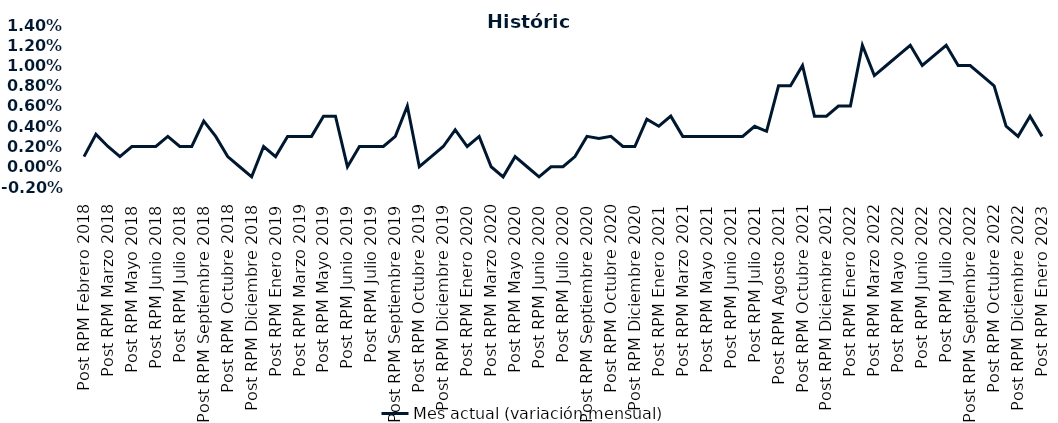
| Category | Mes actual (variación mensual)  |
|---|---|
| Post RPM Febrero 2018 | 0.001 |
| Pre RPM Marzo 2018 | 0.003 |
| Post RPM Marzo 2018 | 0.002 |
| Pre RPM Mayo 2018 | 0.001 |
| Post RPM Mayo 2018 | 0.002 |
| Pre RPM Junio 2018 | 0.002 |
| Post RPM Junio 2018 | 0.002 |
| Pre RPM Julio 2018 | 0.003 |
| Post RPM Julio 2018 | 0.002 |
| Pre RPM Septiembre 2018 | 0.002 |
| Post RPM Septiembre 2018 | 0.004 |
| Pre RPM Octubre 2018 | 0.003 |
| Post RPM Octubre 2018 | 0.001 |
| Pre RPM Diciembre 2018 | 0 |
| Post RPM Diciembre 2018 | -0.001 |
| Pre RPM Enero 2019 | 0.002 |
| Post RPM Enero 2019 | 0.001 |
| Pre RPM Marzo 2019 | 0.003 |
| Post RPM Marzo 2019 | 0.003 |
| Pre RPM Mayo 2019 | 0.003 |
| Post RPM Mayo 2019 | 0.005 |
| Pre RPM Junio 2019 | 0.005 |
| Post RPM Junio 2019 | 0 |
| Pre RPM Julio 2019 | 0.002 |
| Post RPM Julio 2019 | 0.002 |
| Pre RPM Septiembre 2019 | 0.002 |
| Post RPM Septiembre 2019 | 0.003 |
| Pre RPM Octubre 2019 | 0.006 |
| Post RPM Octubre 2019 | 0 |
| Pre RPM Diciembre 2019 | 0.001 |
| Post RPM Diciembre 2019 | 0.002 |
| Pre RPM Enero 2020 | 0.004 |
| Post RPM Enero 2020 | 0.002 |
| Pre RPM Marzo 2020 | 0.003 |
| Post RPM Marzo 2020 | 0 |
| Pre RPM Mayo 2020 | -0.001 |
| Post RPM Mayo 2020 | 0.001 |
| Pre RPM Junio 2020 | 0 |
| Post RPM Junio 2020 | -0.001 |
| Pre RPM Julio 2020 | 0 |
| Post RPM Julio 2020 | 0 |
| Pre RPM Septiembre 2020 | 0.001 |
| Post RPM Septiembre 2020 | 0.003 |
| Pre RPM Octubre 2020 | 0.003 |
| Post RPM Octubre 2020 | 0.003 |
| Pre RPM Diciembre 2020 | 0.002 |
| Post RPM Diciembre 2020 | 0.002 |
| Pre RPM Enero 2021 | 0.005 |
| Post RPM Enero 2021 | 0.004 |
| Pre RPM Marzo 2021 | 0.005 |
| Post RPM Marzo 2021 | 0.003 |
| Pre RPM Mayo 2021 | 0.003 |
| Post RPM Mayo 2021 | 0.003 |
| Pre RPM Junio 2021 | 0.003 |
| Post RPM Junio 2021 | 0.003 |
| Pre RPM Julio 2021 | 0.003 |
| Post RPM Julio 2021 | 0.004 |
| Pre RPM Agosto 2021 | 0.004 |
| Post RPM Agosto 2021 | 0.008 |
| Pre RPM Octubre 2021 | 0.008 |
| Post RPM Octubre 2021 | 0.01 |
| Pre RPM Diciembre 2021 | 0.005 |
| Post RPM Diciembre 2021 | 0.005 |
| Pre RPM Enero 2022 | 0.006 |
| Post RPM Enero 2022 | 0.006 |
| Pre RPM Marzo 2022 | 0.012 |
| Post RPM Marzo 2022 | 0.009 |
| Pre RPM Mayo 2022 | 0.01 |
| Post RPM Mayo 2022 | 0.011 |
| Pre RPM Junio 2022 | 0.012 |
| Post RPM Junio 2022 | 0.01 |
| Pre RPM Julio 2022 | 0.011 |
| Post RPM Julio 2022 | 0.012 |
| Pre RPM Septiembre 2022 | 0.01 |
| Post RPM Septiembre 2022 | 0.01 |
| Pre RPM Octubre 2022 | 0.009 |
| Post RPM Octubre 2022 | 0.008 |
| Pre RPM Diciembre 2022 | 0.004 |
| Post RPM Diciembre 2022 | 0.003 |
| Pre RPM Enero 2023 | 0.005 |
| Post RPM Enero 2023 | 0.003 |